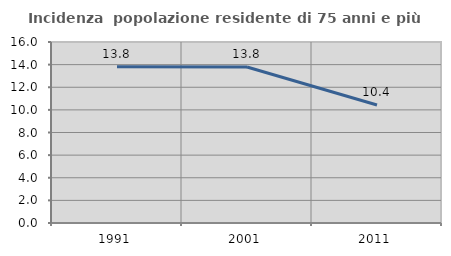
| Category | Incidenza  popolazione residente di 75 anni e più |
|---|---|
| 1991.0 | 13.82 |
| 2001.0 | 13.793 |
| 2011.0 | 10.433 |